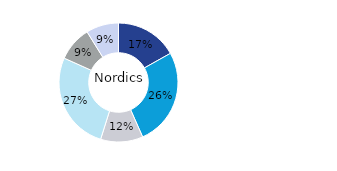
| Category | Nordics |
|---|---|
| Office | 0.169 |
| Residential | 0.265 |
| Retail | 0.115 |
| Logistics* | 0.268 |
| Public Sector** | 0.095 |
| Other | 0.088 |